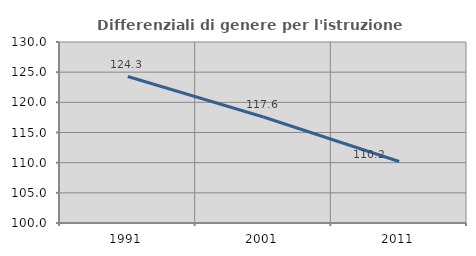
| Category | Differenziali di genere per l'istruzione superiore |
|---|---|
| 1991.0 | 124.28 |
| 2001.0 | 117.576 |
| 2011.0 | 110.193 |